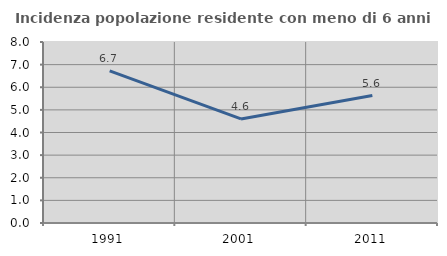
| Category | Incidenza popolazione residente con meno di 6 anni |
|---|---|
| 1991.0 | 6.728 |
| 2001.0 | 4.599 |
| 2011.0 | 5.632 |